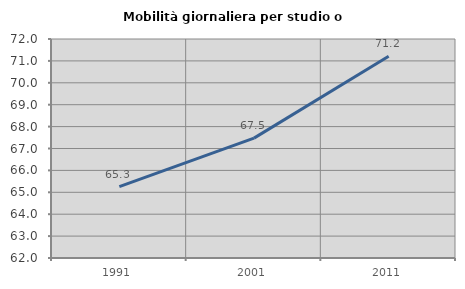
| Category | Mobilità giornaliera per studio o lavoro |
|---|---|
| 1991.0 | 65.261 |
| 2001.0 | 67.474 |
| 2011.0 | 71.214 |